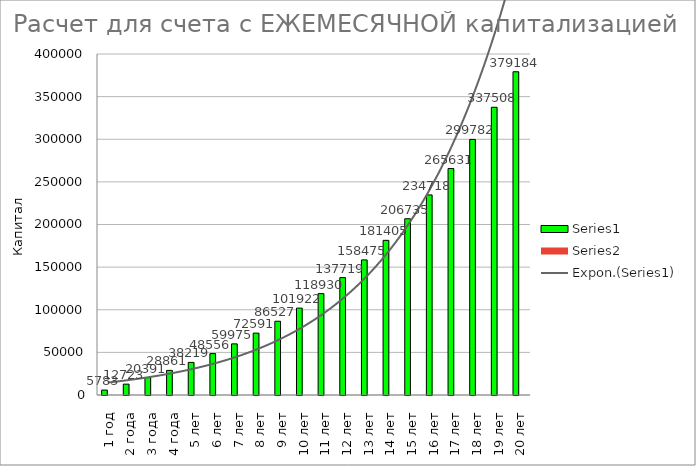
| Category | Series 0 | Series 1 |
|---|---|---|
| 1 год | 5782.784 |  |
| 2 года | 12723.458 |  |
| 3 года | 20390.911 |  |
| 4 года | 28861.246 |  |
| 5 лет | 38218.536 |  |
| 6 лет | 48555.657 |  |
| 7 лет | 59975.209 |  |
| 8 лет | 72590.538 |  |
| 9 лет | 86526.856 |  |
| 10 лет | 101922.489 |  |
| 11 лет | 118930.247 |  |
| 12 лет | 137718.938 |  |
| 13 лет | 158475.051 |  |
| 14 лет | 181404.6 |  |
| 15 лет | 206735.173 |  |
| 16 лет | 234718.188 |  |
| 17 лет | 265631.39 |  |
| 18 лет | 299781.608 |  |
| 19 лет | 337507.8 |  |
| 20 лет | 379184.418 |  |